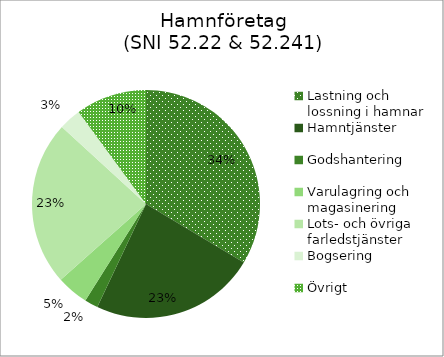
| Category | Bogsering Hamntjänster Lots- och övriga farledstjänster Varulagring och magasinering Godshantering Lastning och lossning i hamnar Övrigt |
|---|---|
| Lastning och lossning i hamnar | 3226.291 |
| Hamntjänster | 2251.004 |
| Godshantering | 182.843 |
| Varulagring och magasinering | 434.413 |
| Lots- och övriga farledstjänster | 2242.012 |
| Bogsering | 301.438 |
| Övrigt | 967 |